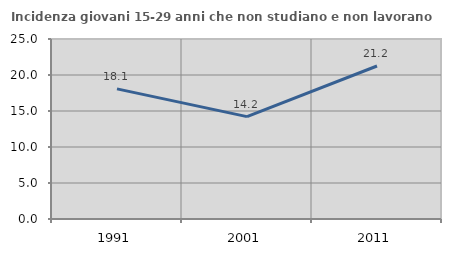
| Category | Incidenza giovani 15-29 anni che non studiano e non lavorano  |
|---|---|
| 1991.0 | 18.072 |
| 2001.0 | 14.216 |
| 2011.0 | 21.248 |